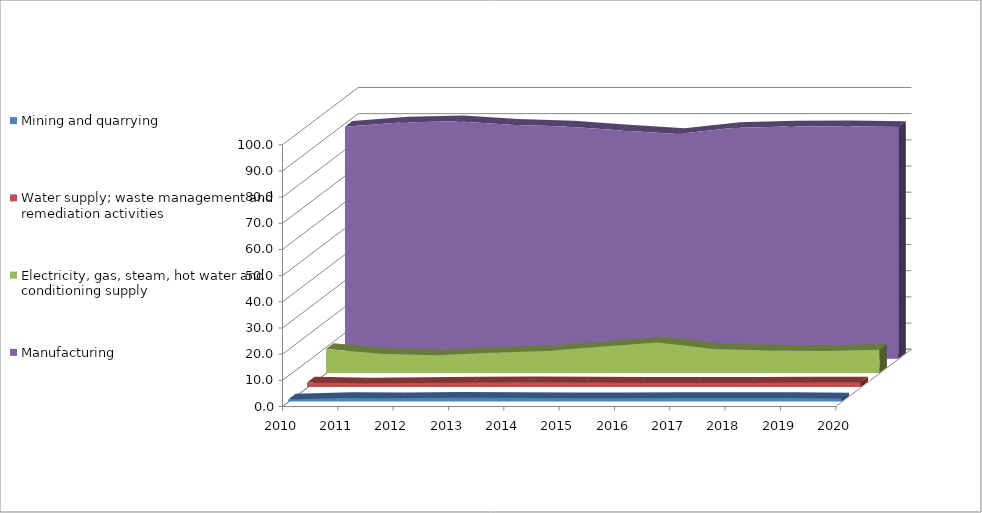
| Category | Mining and quarrying | Water supply; waste management and remediation activities | Electricity, gas, steam, hot water and conditioning supply | Manufacturing |
|---|---|---|---|---|
| 0 | 0.7 | 1.7 | 9.1 | 88.5 |
| 1 | 1.3 | 1.4 | 7.2 | 90.1 |
| 2 | 1.2 | 1.5 | 6.7 | 90.6 |
| 3 | 1.4 | 1.7 | 7.6 | 89.3 |
| 4 | 1.33 | 1.8 | 8.28 | 88.6 |
| 5 | 1.2 | 1.7 | 10 | 87.1 |
| 6 | 1.2 | 1.6 | 11.5 | 85.7 |
| 7 | 1.3 | 1.6 | 9.1 | 88 |
| 8 | 1.3 | 1.6 | 8.5 | 88.6 |
| 9 | 1.3 | 1.7 | 8.3 | 88.7 |
| 10 | 1.1 | 1.7 | 8.8 | 88.4 |